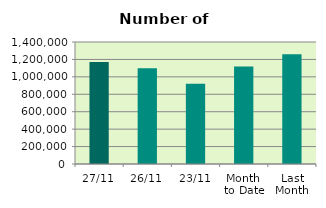
| Category | Series 0 |
|---|---|
| 27/11 | 1171712 |
| 26/11 | 1097594 |
| 23/11 | 919766 |
| Month 
to Date | 1118332.421 |
| Last
Month | 1260789.391 |